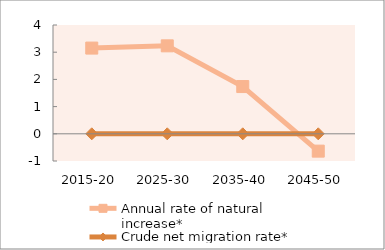
| Category | Annual rate of natural increase* | Crude net migration rate* |
|---|---|---|
| 2015-20 | 3.151 | 0 |
| 2025-30 | 3.234 | 0 |
| 2035-40 | 1.737 | 0 |
| 2045-50 | -0.637 | 0 |